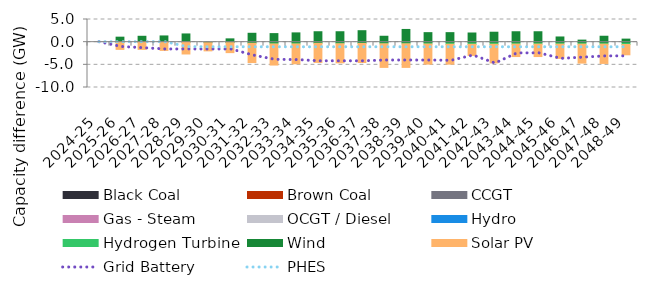
| Category | Black Coal | Brown Coal | CCGT | Gas - Steam | OCGT / Diesel | Hydro | Hydrogen Turbine | Wind | Solar PV |
|---|---|---|---|---|---|---|---|---|---|
| 2024-25 | 0 | 0 | 0 | 0 | 0 | 0 | 0 | 0 | 0 |
| 2025-26 | 0 | 0 | 0 | 0 | 0 | 0 | 0 | 1.103 | -1.593 |
| 2026-27 | 0 | 0 | 0 | 0 | 0 | 0 | 0 | 1.298 | -1.593 |
| 2027-28 | 0 | 0 | 0 | 0 | 0 | 0 | 0 | 1.373 | -1.817 |
| 2028-29 | 0 | 0 | 0 | 0 | 0 | 0 | 0 | 1.813 | -2.606 |
| 2029-30 | 0 | 0 | 0 | 0 | 0 | 0 | 0 | -0.121 | -1.795 |
| 2030-31 | 0 | 0 | 0 | 0 | 0 | 0 | -0.1 | 0.728 | -2.208 |
| 2031-32 | 0 | 0 | 0 | 0 | 0 | 0 | -0.245 | 1.959 | -4.248 |
| 2032-33 | 0 | 0 | 0 | 0 | 0 | 0 | -0.404 | 1.888 | -4.645 |
| 2033-34 | 0 | 0 | 0 | 0 | 0 | 0 | -0.404 | 2.047 | -4.365 |
| 2034-35 | 0 | 0 | 0 | 0 | 0 | 0 | -0.256 | 2.3 | -4.208 |
| 2035-36 | 0 | 0 | 0 | 0 | 0 | 0 | -0.352 | 2.3 | -4.208 |
| 2036-37 | 0 | 0 | 0 | 0 | 0 | 0 | -0.28 | 2.53 | -4.208 |
| 2037-38 | 0 | 0 | 0 | 0 | 0 | 0 | -0.366 | 1.304 | -5.198 |
| 2038-39 | 0 | 0 | 0 | 0 | 0 | 0 | -0.366 | 2.806 | -5.198 |
| 2039-40 | 0 | 0 | 0 | 0 | 0 | 0 | -0.414 | 2.1 | -4.433 |
| 2040-41 | 0 | 0 | 0 | 0 | 0 | 0 | -0.465 | 2.1 | -4.382 |
| 2041-42 | 0 | 0 | 0 | 0 | 0 | 0 | -0.477 | 2.022 | -2.45 |
| 2042-43 | 0 | 0 | 0 | 0 | 0 | 0 | -0.477 | 2.195 | -4.098 |
| 2043-44 | 0 | 0 | 0 | 0 | 0 | 0 | -0.442 | 2.298 | -2.731 |
| 2044-45 | 0 | 0 | 0 | 0 | 0 | 0 | -0.442 | 2.298 | -2.731 |
| 2045-46 | 0 | 0 | 0 | 0 | 0 | 0 | -0.442 | 1.146 | -3.128 |
| 2046-47 | 0 | 0 | 0 | 0 | 0 | 0 | -0.442 | 0.453 | -4.175 |
| 2047-48 | 0 | 0 | 0 | 0 | 0 | 0 | -0.442 | 1.306 | -4.247 |
| 2048-49 | 0 | 0 | 0 | 0 | 0 | 0 | -0.521 | 0.673 | -2.263 |